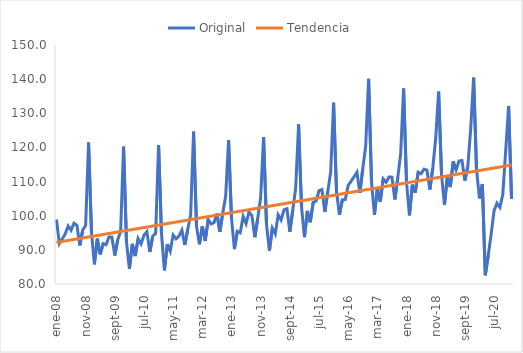
| Category | Original | Tendencia |
|---|---|---|
| 2008-01-01 | 98.866 | 92.181 |
| 2008-02-01 | 91.845 | 92.326 |
| 2008-03-01 | 93.189 | 92.471 |
| 2008-04-01 | 94.632 | 92.616 |
| 2008-05-01 | 96.978 | 92.762 |
| 2008-06-01 | 95.732 | 92.907 |
| 2008-07-01 | 97.799 | 93.052 |
| 2008-08-01 | 97.212 | 93.198 |
| 2008-09-01 | 91.285 | 93.343 |
| 2008-10-01 | 95.806 | 93.488 |
| 2008-11-01 | 97.131 | 93.634 |
| 2008-12-01 | 121.45 | 93.779 |
| 2009-01-01 | 95.276 | 93.924 |
| 2009-02-01 | 85.776 | 94.07 |
| 2009-03-01 | 93.28 | 94.215 |
| 2009-04-01 | 88.678 | 94.36 |
| 2009-05-01 | 91.826 | 94.506 |
| 2009-06-01 | 91.529 | 94.651 |
| 2009-07-01 | 93.734 | 94.796 |
| 2009-08-01 | 93.778 | 94.942 |
| 2009-09-01 | 88.341 | 95.087 |
| 2009-10-01 | 92.941 | 95.232 |
| 2009-11-01 | 95.372 | 95.377 |
| 2009-12-01 | 120.247 | 95.523 |
| 2010-01-01 | 92.32 | 95.668 |
| 2010-02-01 | 84.42 | 95.813 |
| 2010-03-01 | 91.762 | 95.959 |
| 2010-04-01 | 88.178 | 96.104 |
| 2010-05-01 | 93.303 | 96.249 |
| 2010-06-01 | 91.747 | 96.395 |
| 2010-07-01 | 94.264 | 96.54 |
| 2010-08-01 | 95.339 | 96.685 |
| 2010-09-01 | 89.376 | 96.831 |
| 2010-10-01 | 94.015 | 96.976 |
| 2010-11-01 | 94.801 | 97.121 |
| 2010-12-01 | 120.698 | 97.267 |
| 2011-01-01 | 94.918 | 97.412 |
| 2011-02-01 | 83.987 | 97.557 |
| 2011-03-01 | 91.666 | 97.703 |
| 2011-04-01 | 89.605 | 97.848 |
| 2011-05-01 | 94.353 | 97.993 |
| 2011-06-01 | 93.231 | 98.138 |
| 2011-07-01 | 94.074 | 98.284 |
| 2011-08-01 | 95.789 | 98.429 |
| 2011-09-01 | 91.436 | 98.574 |
| 2011-10-01 | 95.961 | 98.72 |
| 2011-11-01 | 100.165 | 98.865 |
| 2011-12-01 | 124.623 | 99.01 |
| 2012-01-01 | 97.006 | 99.156 |
| 2012-02-01 | 91.631 | 99.301 |
| 2012-03-01 | 96.93 | 99.446 |
| 2012-04-01 | 92.591 | 99.592 |
| 2012-05-01 | 98.884 | 99.737 |
| 2012-06-01 | 97.579 | 99.882 |
| 2012-07-01 | 97.976 | 100.028 |
| 2012-08-01 | 100.634 | 100.173 |
| 2012-09-01 | 95.261 | 100.318 |
| 2012-10-01 | 100.738 | 100.464 |
| 2012-11-01 | 105.68 | 100.609 |
| 2012-12-01 | 122.082 | 100.754 |
| 2013-01-01 | 99.32 | 100.899 |
| 2013-02-01 | 90.235 | 101.045 |
| 2013-03-01 | 95.429 | 101.19 |
| 2013-04-01 | 95.022 | 101.335 |
| 2013-05-01 | 99.806 | 101.481 |
| 2013-06-01 | 97.695 | 101.626 |
| 2013-07-01 | 101.068 | 101.771 |
| 2013-08-01 | 100.029 | 101.917 |
| 2013-09-01 | 93.71 | 102.062 |
| 2013-10-01 | 99.24 | 102.207 |
| 2013-11-01 | 105.378 | 102.353 |
| 2013-12-01 | 123.068 | 102.498 |
| 2014-01-01 | 97.427 | 102.643 |
| 2014-02-01 | 89.714 | 102.789 |
| 2014-03-01 | 96.392 | 102.934 |
| 2014-04-01 | 94.683 | 103.079 |
| 2014-05-01 | 100.238 | 103.224 |
| 2014-06-01 | 98.75 | 103.37 |
| 2014-07-01 | 101.712 | 103.515 |
| 2014-08-01 | 102.042 | 103.66 |
| 2014-09-01 | 95.303 | 103.806 |
| 2014-10-01 | 101.569 | 103.951 |
| 2014-11-01 | 108.059 | 104.096 |
| 2014-12-01 | 126.707 | 104.242 |
| 2015-01-01 | 102.635 | 104.387 |
| 2015-02-01 | 93.71 | 104.532 |
| 2015-03-01 | 101.403 | 104.678 |
| 2015-04-01 | 98.067 | 104.823 |
| 2015-05-01 | 103.919 | 104.968 |
| 2015-06-01 | 104.293 | 105.114 |
| 2015-07-01 | 107.342 | 105.259 |
| 2015-08-01 | 107.646 | 105.404 |
| 2015-09-01 | 101.08 | 105.55 |
| 2015-10-01 | 107.045 | 105.695 |
| 2015-11-01 | 112.803 | 105.84 |
| 2015-12-01 | 133.104 | 105.985 |
| 2016-01-01 | 107.03 | 106.131 |
| 2016-02-01 | 100.26 | 106.276 |
| 2016-03-01 | 104.644 | 106.421 |
| 2016-04-01 | 104.733 | 106.567 |
| 2016-05-01 | 108.885 | 106.712 |
| 2016-06-01 | 110.12 | 106.857 |
| 2016-07-01 | 111.36 | 107.003 |
| 2016-08-01 | 112.742 | 107.148 |
| 2016-09-01 | 106.705 | 107.293 |
| 2016-10-01 | 113.718 | 107.439 |
| 2016-11-01 | 120.404 | 107.584 |
| 2016-12-01 | 140.083 | 107.729 |
| 2017-01-01 | 109.896 | 107.875 |
| 2017-02-01 | 100.245 | 108.02 |
| 2017-03-01 | 108.211 | 108.165 |
| 2017-04-01 | 104.05 | 108.311 |
| 2017-05-01 | 110.791 | 108.456 |
| 2017-06-01 | 109.806 | 108.601 |
| 2017-07-01 | 111.354 | 108.746 |
| 2017-08-01 | 111.295 | 108.892 |
| 2017-09-01 | 104.769 | 109.037 |
| 2017-10-01 | 111.103 | 109.182 |
| 2017-11-01 | 118.261 | 109.328 |
| 2017-12-01 | 137.265 | 109.473 |
| 2018-01-01 | 109.745 | 109.618 |
| 2018-02-01 | 100.093 | 109.764 |
| 2018-03-01 | 109.111 | 109.909 |
| 2018-04-01 | 106.743 | 110.054 |
| 2018-05-01 | 112.744 | 110.2 |
| 2018-06-01 | 112.315 | 110.345 |
| 2018-07-01 | 113.64 | 110.49 |
| 2018-08-01 | 113.369 | 110.636 |
| 2018-09-01 | 107.673 | 110.781 |
| 2018-10-01 | 113.974 | 110.926 |
| 2018-11-01 | 122.674 | 111.072 |
| 2018-12-01 | 136.356 | 111.217 |
| 2019-01-01 | 112.044 | 111.362 |
| 2019-02-01 | 103.226 | 111.507 |
| 2019-03-01 | 111.457 | 111.653 |
| 2019-04-01 | 108.39 | 111.798 |
| 2019-05-01 | 115.875 | 111.943 |
| 2019-06-01 | 113.452 | 112.089 |
| 2019-07-01 | 116.021 | 112.234 |
| 2019-08-01 | 116.178 | 112.379 |
| 2019-09-01 | 110.286 | 112.525 |
| 2019-10-01 | 114.357 | 112.67 |
| 2019-11-01 | 125.47 | 112.815 |
| 2019-12-01 | 140.451 | 112.961 |
| 2020-01-01 | 113.485 | 113.106 |
| 2020-02-01 | 105.073 | 113.251 |
| 2020-03-01 | 109.275 | 113.397 |
| 2020-04-01 | 82.558 | 113.542 |
| 2020-05-01 | 88.321 | 113.687 |
| 2020-06-01 | 94.531 | 113.833 |
| 2020-07-01 | 101.439 | 113.978 |
| 2020-08-01 | 103.669 | 114.123 |
| 2020-09-01 | 102.464 | 114.268 |
| 2020-10-01 | 106.225 | 114.414 |
| 2020-11-01 | 119.087 | 114.559 |
| 2020-12-01 | 132.106 | 114.704 |
| 2021-01-01 | 104.898 | 114.85 |